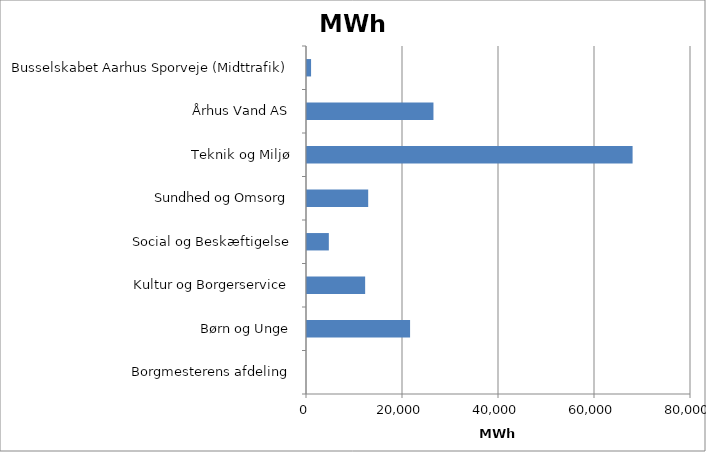
| Category | Elforbrug MWh |
|---|---|
| Borgmesterens afdeling | 0 |
| Børn og Unge | 21474.704 |
| Kultur og Borgerservice | 12114.216 |
| Social og Beskæftigelse | 4548.262 |
| Sundhed og Omsorg | 12749.826 |
| Teknik og Miljø | 67830.988 |
| Århus Vand AS | 26344.765 |
| Busselskabet Aarhus Sporveje (Midttrafik) | 848.118 |